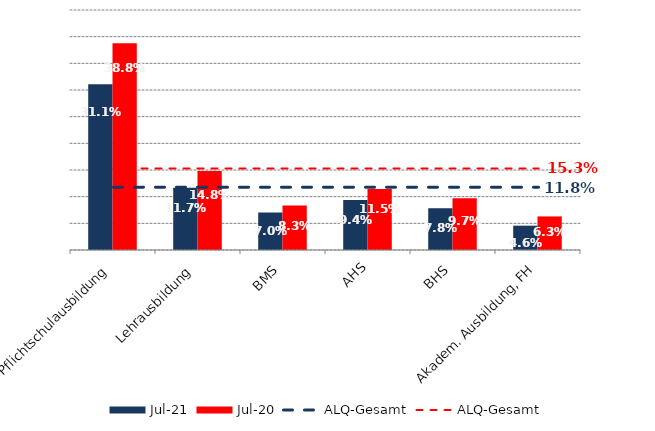
| Category | Jul 21 | Jul 20 |
|---|---|---|
| Pflichtschulausbildung | 0.311 | 0.388 |
| Lehrausbildung | 0.117 | 0.148 |
| BMS | 0.07 | 0.083 |
| AHS | 0.094 | 0.115 |
| BHS | 0.078 | 0.097 |
| Akadem. Ausbildung, FH | 0.046 | 0.063 |